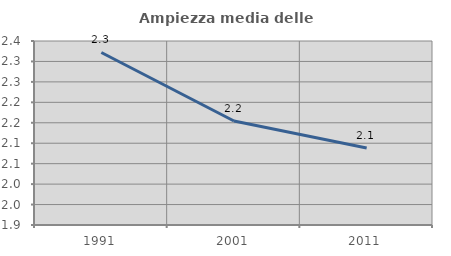
| Category | Ampiezza media delle famiglie |
|---|---|
| 1991.0 | 2.322 |
| 2001.0 | 2.154 |
| 2011.0 | 2.089 |